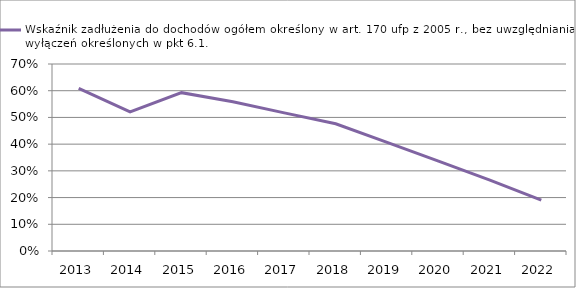
| Category | Wskaźnik zadłużenia do dochodów ogółem określony w art. 170 ufp z 2005 r., bez uwzględniania wyłączeń określonych w pkt 6.1. |
|---|---|
| 2013.0 | 0.609 |
| 2014.0 | 0.52 |
| 2015.0 | 0.593 |
| 2016.0 | 0.559 |
| 2017.0 | 0.517 |
| 2018.0 | 0.476 |
| 2019.0 | 0.407 |
| 2020.0 | 0.337 |
| 2021.0 | 0.265 |
| 2022.0 | 0.191 |